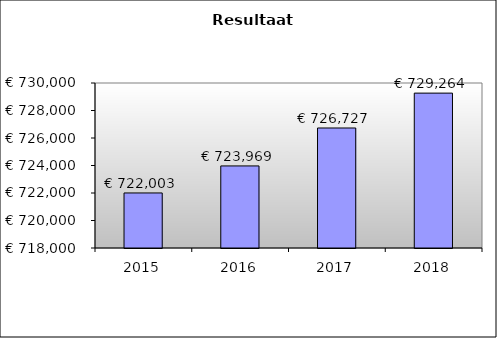
| Category | Series 0 |
|---|---|
| 2015.0 | 722002.755 |
| 2016.0 | 723968.703 |
| 2017.0 | 726727.283 |
| 2018.0 | 729263.923 |